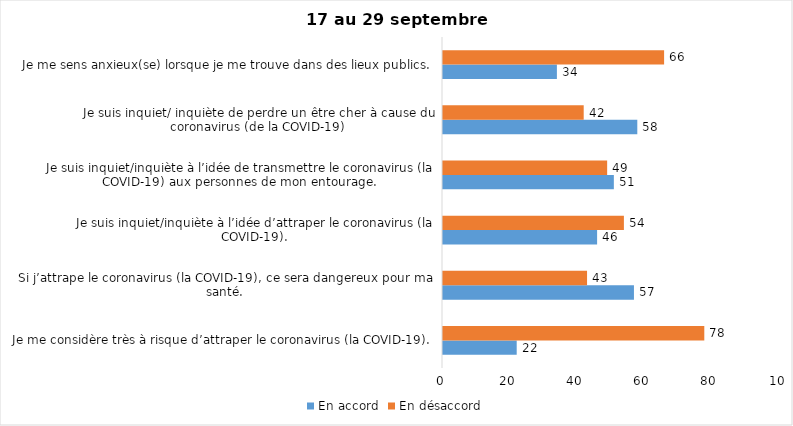
| Category | En accord | En désaccord |
|---|---|---|
| Je me considère très à risque d’attraper le coronavirus (la COVID-19). | 22 | 78 |
| Si j’attrape le coronavirus (la COVID-19), ce sera dangereux pour ma santé. | 57 | 43 |
| Je suis inquiet/inquiète à l’idée d’attraper le coronavirus (la COVID-19). | 46 | 54 |
| Je suis inquiet/inquiète à l’idée de transmettre le coronavirus (la COVID-19) aux personnes de mon entourage. | 51 | 49 |
| Je suis inquiet/ inquiète de perdre un être cher à cause du coronavirus (de la COVID-19) | 58 | 42 |
| Je me sens anxieux(se) lorsque je me trouve dans des lieux publics. | 34 | 66 |